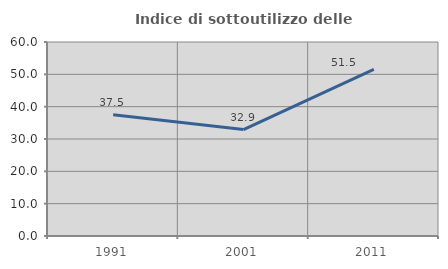
| Category | Indice di sottoutilizzo delle abitazioni  |
|---|---|
| 1991.0 | 37.5 |
| 2001.0 | 32.931 |
| 2011.0 | 51.505 |